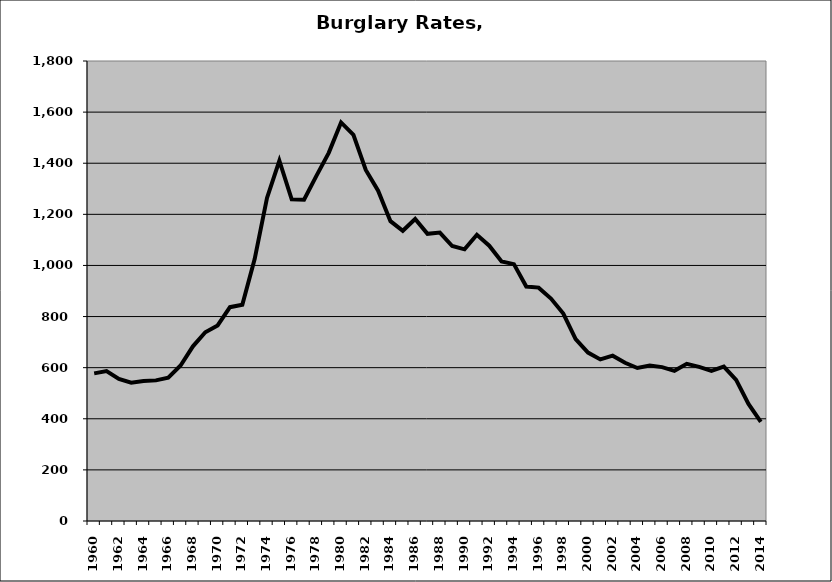
| Category | Burglary |
|---|---|
| 1960.0 | 577.721 |
| 1961.0 | 586.898 |
| 1962.0 | 555.657 |
| 1963.0 | 541.318 |
| 1964.0 | 547.393 |
| 1965.0 | 550.225 |
| 1966.0 | 560.52 |
| 1967.0 | 608.483 |
| 1968.0 | 683.552 |
| 1969.0 | 738.68 |
| 1970.0 | 765.406 |
| 1971.0 | 836.745 |
| 1972.0 | 846.058 |
| 1973.0 | 1025.125 |
| 1974.0 | 1264.19 |
| 1975.0 | 1409.69 |
| 1976.0 | 1258.393 |
| 1977.0 | 1256.968 |
| 1978.0 | 1350.654 |
| 1979.0 | 1440.57 |
| 1980.0 | 1559.648 |
| 1981.0 | 1511.497 |
| 1982.0 | 1373.803 |
| 1983.0 | 1292.399 |
| 1984.0 | 1173.382 |
| 1985.0 | 1135.804 |
| 1986.0 | 1181.878 |
| 1987.0 | 1123.701 |
| 1988.0 | 1128.656 |
| 1989.0 | 1076.008 |
| 1990.0 | 1062.989 |
| 1991.0 | 1120.021 |
| 1992.0 | 1077.345 |
| 1993.0 | 1015.542 |
| 1994.0 | 1005.071 |
| 1995.0 | 917.625 |
| 1996.0 | 913.185 |
| 1997.0 | 870.461 |
| 1998.0 | 811.889 |
| 1999.0 | 711.695 |
| 2000.0 | 659.055 |
| 2001.0 | 632.241 |
| 2002.0 | 647.045 |
| 2003.0 | 619.373 |
| 2004.0 | 598.552 |
| 2005.0 | 608.166 |
| 2006.0 | 602.082 |
| 2007.0 | 587.619 |
| 2008.0 | 614.874 |
| 2009.0 | 603.002 |
| 2010.0 | 587.648 |
| 2011.0 | 604.358 |
| 2012.0 | 552.525 |
| 2013.0 | 458.421 |
| 2014.0 | 388.243 |